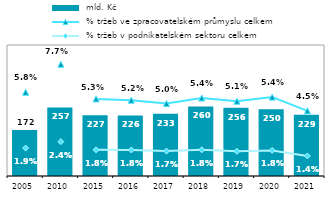
| Category |  mld. Kč |
|---|---|
| 2005.0 | 172.086 |
| 2010.0 | 256.64 |
| 2015.0 | 226.828 |
| 2016.0 | 226.336 |
| 2017.0 | 233.272 |
| 2018.0 | 260.301 |
| 2019.0 | 255.587 |
| 2020.0 | 249.802 |
| 2021.0 | 229.065 |